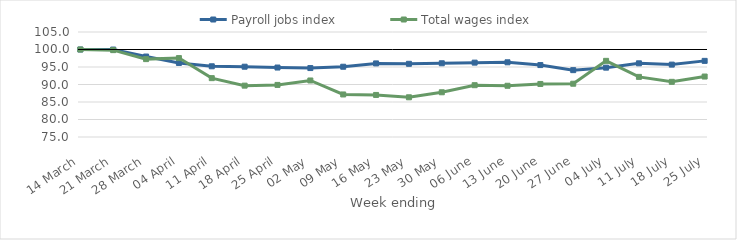
| Category | Payroll jobs index | Total wages index |
|---|---|---|
| 2020-03-14 | 100 | 100 |
| 2020-03-21 | 99.984 | 99.818 |
| 2020-03-28 | 97.988 | 97.251 |
| 2020-04-04 | 96.154 | 97.548 |
| 2020-04-11 | 95.204 | 91.813 |
| 2020-04-18 | 95.081 | 89.673 |
| 2020-04-25 | 94.848 | 89.881 |
| 2020-05-02 | 94.692 | 91.151 |
| 2020-05-09 | 95.073 | 87.155 |
| 2020-05-16 | 96.025 | 87.015 |
| 2020-05-23 | 95.915 | 86.347 |
| 2020-05-30 | 96.066 | 87.778 |
| 2020-06-06 | 96.246 | 89.801 |
| 2020-06-13 | 96.343 | 89.638 |
| 2020-06-20 | 95.552 | 90.156 |
| 2020-06-27 | 94.1 | 90.223 |
| 2020-07-04 | 94.814 | 96.759 |
| 2020-07-11 | 96.05 | 92.177 |
| 2020-07-18 | 95.683 | 90.761 |
| 2020-07-25 | 96.751 | 92.273 |